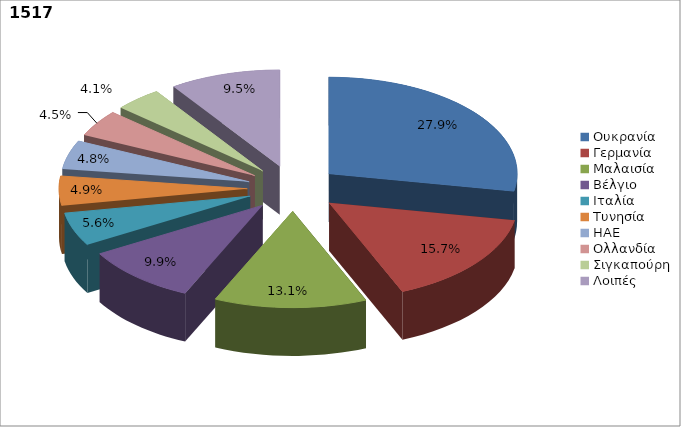
| Category | Series 0 |
|---|---|
| Ουκρανία | 0.279 |
| Γερμανία | 0.157 |
| Μαλαισία | 0.131 |
| Βέλγιο | 0.099 |
| Ιταλία | 0.056 |
| Τυνησία | 0.049 |
| ΗΑΕ | 0.048 |
| Ολλανδία | 0.045 |
| Σιγκαπούρη | 0.041 |
| Λοιπές | 0.095 |